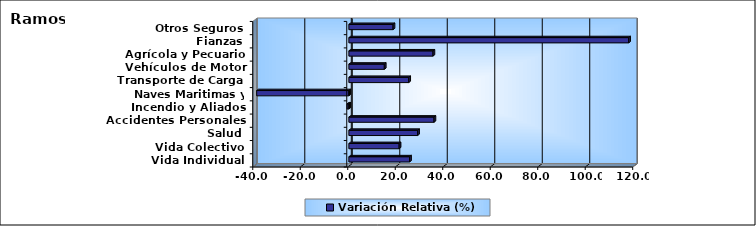
| Category | Variación Relativa (%) |
|---|---|
| Vida Individual | 25.57 |
| Vida Colectivo | 21.168 |
| Salud | 28.953 |
| Accidentes Personales | 35.852 |
| Incendio y Aliados | -0.743 |
| Naves Maritimas y Aéreas | -38.806 |
| Transporte de Carga | 25.215 |
| Vehículos de Motor | 14.933 |
| Agrícola y Pecuario | 35.424 |
| Fianzas | 117.845 |
| Otros Seguros | 18.612 |